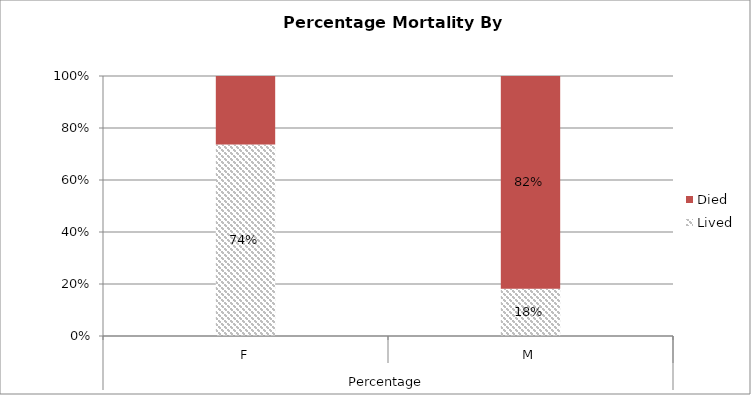
| Category | Lived | Died |
|---|---|---|
| 0 | 0.736 | 0.264 |
| 1 | 0.181 | 0.819 |